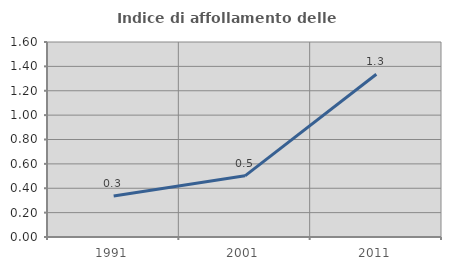
| Category | Indice di affollamento delle abitazioni  |
|---|---|
| 1991.0 | 0.336 |
| 2001.0 | 0.502 |
| 2011.0 | 1.336 |